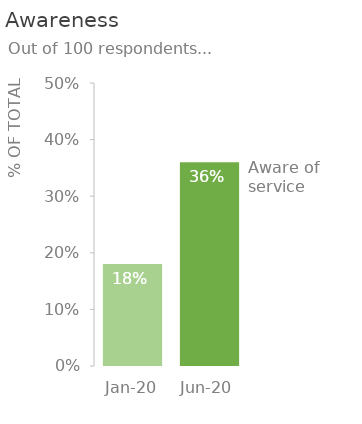
| Category | Aware |
|---|---|
| 2020-01-01 | 0.18 |
| 2020-06-01 | 0.36 |